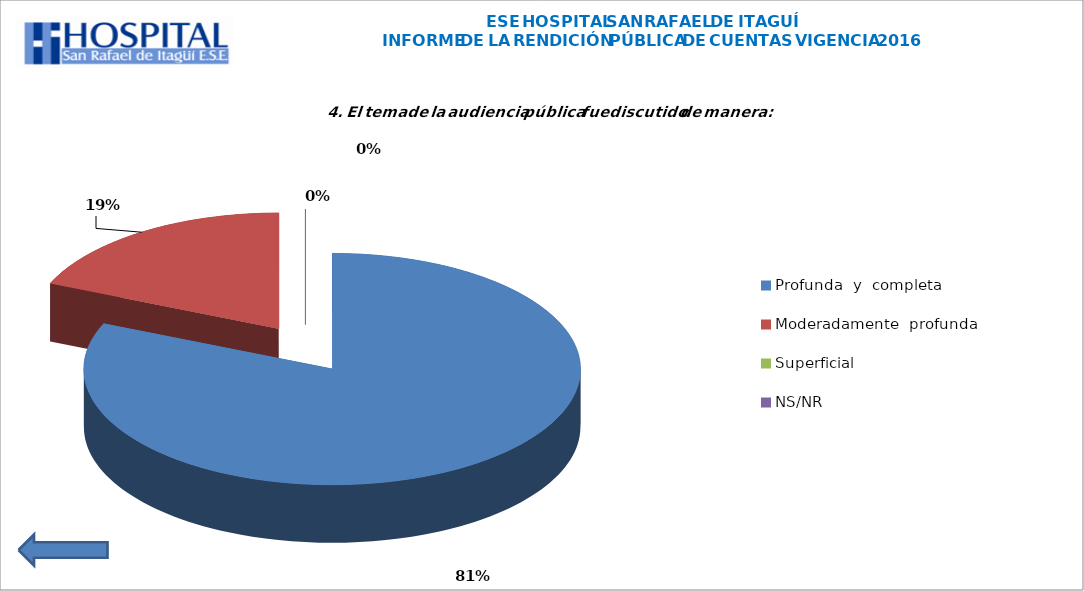
| Category | Series 0 |
|---|---|
| Profunda  y  completa | 35 |
| Moderadamente  profunda | 8 |
| Superficial  | 0 |
| NS/NR | 0 |